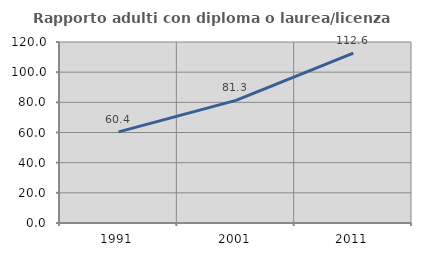
| Category | Rapporto adulti con diploma o laurea/licenza media  |
|---|---|
| 1991.0 | 60.407 |
| 2001.0 | 81.302 |
| 2011.0 | 112.608 |